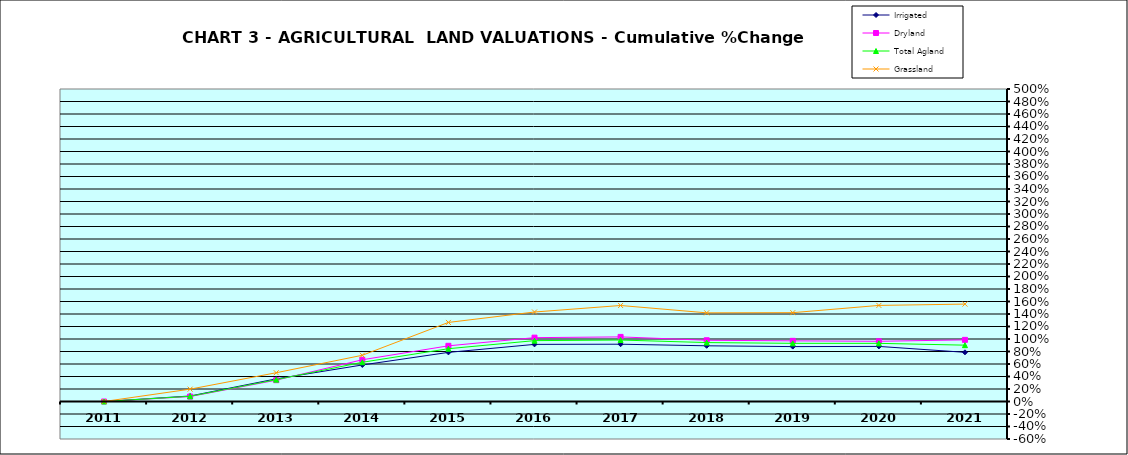
| Category | Irrigated | Dryland | Total Agland | Grassland |
|---|---|---|---|---|
| 2011.0 | 0 | 0 | 0 | 0 |
| 2012.0 | 0.088 | 0.079 | 0.083 | 0.198 |
| 2013.0 | 0.362 | 0.341 | 0.35 | 0.46 |
| 2014.0 | 0.584 | 0.668 | 0.628 | 0.74 |
| 2015.0 | 0.786 | 0.891 | 0.845 | 1.265 |
| 2016.0 | 0.914 | 1.022 | 0.974 | 1.432 |
| 2017.0 | 0.917 | 1.034 | 0.983 | 1.536 |
| 2018.0 | 0.891 | 0.98 | 0.943 | 1.419 |
| 2019.0 | 0.878 | 0.97 | 0.931 | 1.421 |
| 2020.0 | 0.881 | 0.963 | 0.93 | 1.537 |
| 2021.0 | 0.787 | 0.986 | 0.901 | 1.558 |